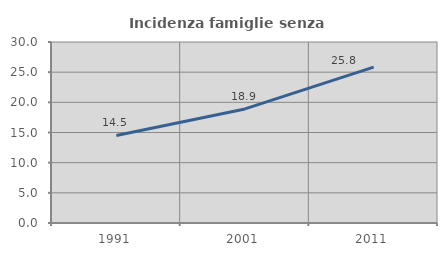
| Category | Incidenza famiglie senza nuclei |
|---|---|
| 1991.0 | 14.506 |
| 2001.0 | 18.906 |
| 2011.0 | 25.839 |